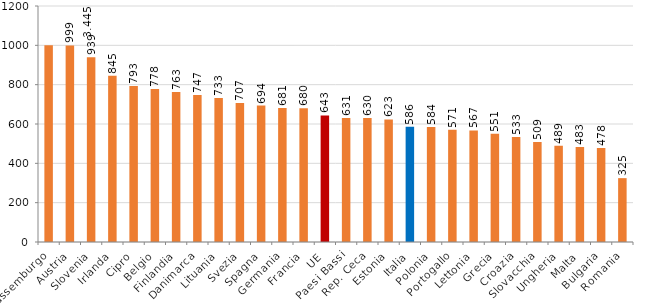
| Category | Series 0 |
|---|---|
| Lussemburgo | 1000 |
| Austria | 999.446 |
| Slovenia | 939.124 |
| Irlanda | 845.367 |
| Cipro | 793.449 |
| Belgio | 777.723 |
| Finlandia | 762.931 |
| Danimarca | 746.876 |
| Lituania | 732.718 |
| Svezia | 706.892 |
| Spagna | 693.696 |
| Germania | 681.324 |
| Francia | 679.528 |
| UE | 643.351 |
| Paesi Bassi | 630.728 |
| Rep. Ceca | 629.888 |
| Estonia | 623.206 |
| Italia | 585.804 |
| Polonia | 584.287 |
| Portogallo | 570.617 |
| Lettonia | 567.123 |
| Grecia | 550.926 |
| Croazia | 533.294 |
| Slovacchia | 508.696 |
| Ungheria | 489.066 |
| Malta | 483.445 |
| Bulgaria | 477.819 |
| Romania | 324.701 |